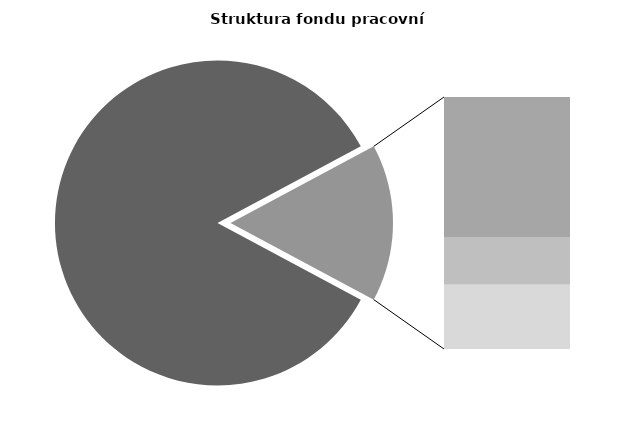
| Category | Series 0 |
|---|---|
| Průměrná měsíční odpracovaná doba bez přesčasu | 144.425 |
| Dovolená | 14.938 |
| Nemoc | 4.998 |
| Jiné | 6.83 |